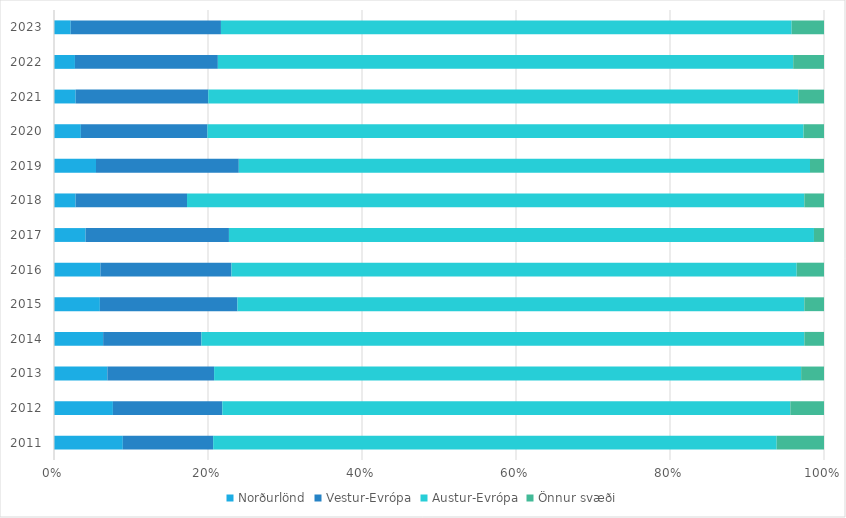
| Category | Norðurlönd | Vestur-Evrópa | Austur-Evrópa | Önnur svæði |
|---|---|---|---|---|
| 2011.0 | 0.089 | 0.117 | 0.732 | 0.061 |
| 2012.0 | 0.077 | 0.142 | 0.738 | 0.044 |
| 2013.0 | 0.069 | 0.139 | 0.762 | 0.03 |
| 2014.0 | 0.064 | 0.128 | 0.783 | 0.026 |
| 2015.0 | 0.06 | 0.179 | 0.736 | 0.026 |
| 2016.0 | 0.06 | 0.17 | 0.734 | 0.035 |
| 2017.0 | 0.041 | 0.186 | 0.76 | 0.013 |
| 2018.0 | 0.028 | 0.145 | 0.802 | 0.026 |
| 2019.0 | 0.055 | 0.185 | 0.742 | 0.018 |
| 2020.0 | 0.035 | 0.164 | 0.774 | 0.027 |
| 2021.0 | 0.028 | 0.172 | 0.766 | 0.033 |
| 2022.0 | 0.027 | 0.186 | 0.747 | 0.04 |
| 2023.0 | 0.022 | 0.195 | 0.741 | 0.042 |